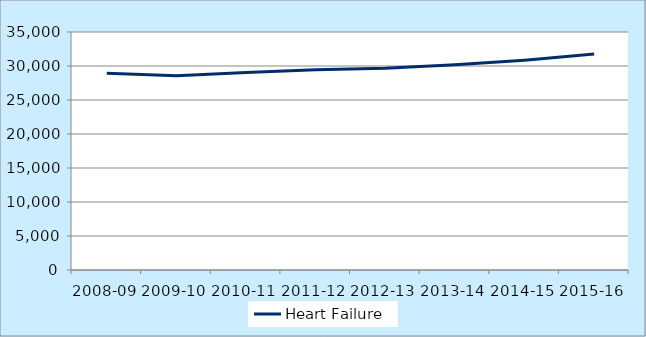
| Category | Heart Failure  |
|---|---|
| 2008-09 | 28932 |
| 2009-10 | 28549 |
| 2010-11 | 29029 |
| 2011-12 | 29454 |
| 2012-13 | 29658 |
| 2013-14 | 30187 |
| 2014-15 | 30859 |
| 2015-16 | 31758 |